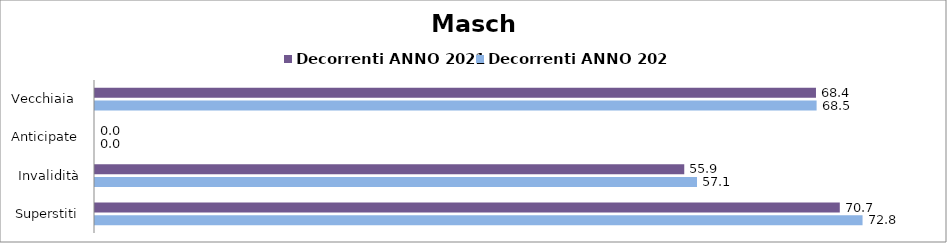
| Category | Decorrenti ANNO 2021 | Decorrenti ANNO 2022 |
|---|---|---|
| Vecchiaia  | 68.42 | 68.48 |
| Anticipate | 0 | 0 |
| Invalidità | 55.92 | 57.13 |
| Superstiti | 70.68 | 72.84 |